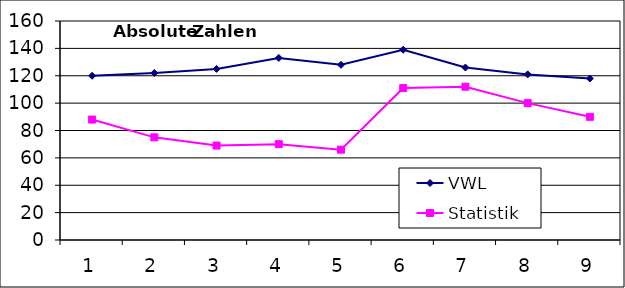
| Category | VWL | Statistik |
|---|---|---|
| 0 | 120 | 88 |
| 1 | 122 | 75 |
| 2 | 125 | 69 |
| 3 | 133 | 70 |
| 4 | 128 | 66 |
| 5 | 139 | 111 |
| 6 | 126 | 112 |
| 7 | 121 | 100 |
| 8 | 118 | 90 |